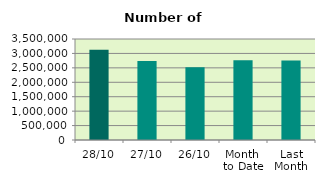
| Category | Series 0 |
|---|---|
| 28/10 | 3125100 |
| 27/10 | 2741462 |
| 26/10 | 2521042 |
| Month 
to Date | 2763668.4 |
| Last
Month | 2759252.364 |